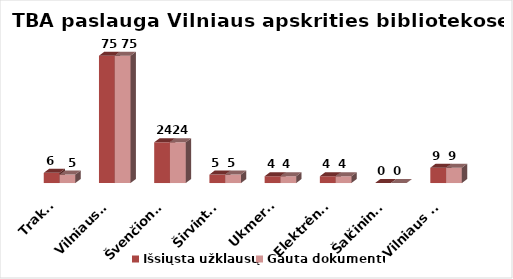
| Category | Išsiųsta užklausų | Gauta dokumentų |
|---|---|---|
| Trakai | 6 | 5 |
| Vilniaus r. | 75 | 75 |
| Švenčionys | 24 | 24 |
| Širvintos | 5 | 5 |
| Ukmergė | 4 | 4 |
| Elektrėnai | 4 | 4 |
| Šalčininkai | 0 | 0 |
| Vilniaus m. | 9 | 9 |